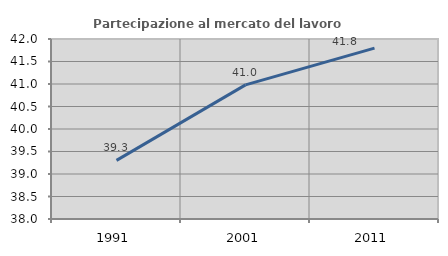
| Category | Partecipazione al mercato del lavoro  femminile |
|---|---|
| 1991.0 | 39.304 |
| 2001.0 | 40.981 |
| 2011.0 | 41.798 |